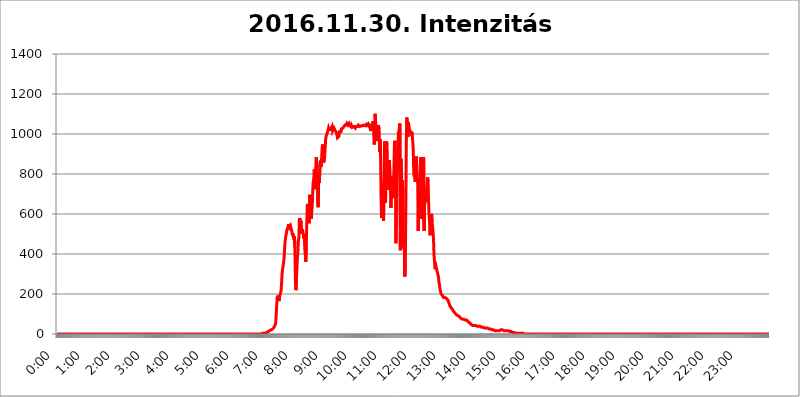
| Category | 2016.11.30. Intenzitás [W/m^2] |
|---|---|
| 0.0 | 0 |
| 0.0006944444444444445 | 0 |
| 0.001388888888888889 | 0 |
| 0.0020833333333333333 | 0 |
| 0.002777777777777778 | 0 |
| 0.003472222222222222 | 0 |
| 0.004166666666666667 | 0 |
| 0.004861111111111111 | 0 |
| 0.005555555555555556 | 0 |
| 0.0062499999999999995 | 0 |
| 0.006944444444444444 | 0 |
| 0.007638888888888889 | 0 |
| 0.008333333333333333 | 0 |
| 0.009027777777777779 | 0 |
| 0.009722222222222222 | 0 |
| 0.010416666666666666 | 0 |
| 0.011111111111111112 | 0 |
| 0.011805555555555555 | 0 |
| 0.012499999999999999 | 0 |
| 0.013194444444444444 | 0 |
| 0.013888888888888888 | 0 |
| 0.014583333333333332 | 0 |
| 0.015277777777777777 | 0 |
| 0.015972222222222224 | 0 |
| 0.016666666666666666 | 0 |
| 0.017361111111111112 | 0 |
| 0.018055555555555557 | 0 |
| 0.01875 | 0 |
| 0.019444444444444445 | 0 |
| 0.02013888888888889 | 0 |
| 0.020833333333333332 | 0 |
| 0.02152777777777778 | 0 |
| 0.022222222222222223 | 0 |
| 0.02291666666666667 | 0 |
| 0.02361111111111111 | 0 |
| 0.024305555555555556 | 0 |
| 0.024999999999999998 | 0 |
| 0.025694444444444447 | 0 |
| 0.02638888888888889 | 0 |
| 0.027083333333333334 | 0 |
| 0.027777777777777776 | 0 |
| 0.02847222222222222 | 0 |
| 0.029166666666666664 | 0 |
| 0.029861111111111113 | 0 |
| 0.030555555555555555 | 0 |
| 0.03125 | 0 |
| 0.03194444444444445 | 0 |
| 0.03263888888888889 | 0 |
| 0.03333333333333333 | 0 |
| 0.034027777777777775 | 0 |
| 0.034722222222222224 | 0 |
| 0.035416666666666666 | 0 |
| 0.036111111111111115 | 0 |
| 0.03680555555555556 | 0 |
| 0.0375 | 0 |
| 0.03819444444444444 | 0 |
| 0.03888888888888889 | 0 |
| 0.03958333333333333 | 0 |
| 0.04027777777777778 | 0 |
| 0.04097222222222222 | 0 |
| 0.041666666666666664 | 0 |
| 0.042361111111111106 | 0 |
| 0.04305555555555556 | 0 |
| 0.043750000000000004 | 0 |
| 0.044444444444444446 | 0 |
| 0.04513888888888889 | 0 |
| 0.04583333333333334 | 0 |
| 0.04652777777777778 | 0 |
| 0.04722222222222222 | 0 |
| 0.04791666666666666 | 0 |
| 0.04861111111111111 | 0 |
| 0.049305555555555554 | 0 |
| 0.049999999999999996 | 0 |
| 0.05069444444444445 | 0 |
| 0.051388888888888894 | 0 |
| 0.052083333333333336 | 0 |
| 0.05277777777777778 | 0 |
| 0.05347222222222222 | 0 |
| 0.05416666666666667 | 0 |
| 0.05486111111111111 | 0 |
| 0.05555555555555555 | 0 |
| 0.05625 | 0 |
| 0.05694444444444444 | 0 |
| 0.057638888888888885 | 0 |
| 0.05833333333333333 | 0 |
| 0.05902777777777778 | 0 |
| 0.059722222222222225 | 0 |
| 0.06041666666666667 | 0 |
| 0.061111111111111116 | 0 |
| 0.06180555555555556 | 0 |
| 0.0625 | 0 |
| 0.06319444444444444 | 0 |
| 0.06388888888888888 | 0 |
| 0.06458333333333334 | 0 |
| 0.06527777777777778 | 0 |
| 0.06597222222222222 | 0 |
| 0.06666666666666667 | 0 |
| 0.06736111111111111 | 0 |
| 0.06805555555555555 | 0 |
| 0.06874999999999999 | 0 |
| 0.06944444444444443 | 0 |
| 0.07013888888888889 | 0 |
| 0.07083333333333333 | 0 |
| 0.07152777777777779 | 0 |
| 0.07222222222222223 | 0 |
| 0.07291666666666667 | 0 |
| 0.07361111111111111 | 0 |
| 0.07430555555555556 | 0 |
| 0.075 | 0 |
| 0.07569444444444444 | 0 |
| 0.0763888888888889 | 0 |
| 0.07708333333333334 | 0 |
| 0.07777777777777778 | 0 |
| 0.07847222222222222 | 0 |
| 0.07916666666666666 | 0 |
| 0.0798611111111111 | 0 |
| 0.08055555555555556 | 0 |
| 0.08125 | 0 |
| 0.08194444444444444 | 0 |
| 0.08263888888888889 | 0 |
| 0.08333333333333333 | 0 |
| 0.08402777777777777 | 0 |
| 0.08472222222222221 | 0 |
| 0.08541666666666665 | 0 |
| 0.08611111111111112 | 0 |
| 0.08680555555555557 | 0 |
| 0.08750000000000001 | 0 |
| 0.08819444444444445 | 0 |
| 0.08888888888888889 | 0 |
| 0.08958333333333333 | 0 |
| 0.09027777777777778 | 0 |
| 0.09097222222222222 | 0 |
| 0.09166666666666667 | 0 |
| 0.09236111111111112 | 0 |
| 0.09305555555555556 | 0 |
| 0.09375 | 0 |
| 0.09444444444444444 | 0 |
| 0.09513888888888888 | 0 |
| 0.09583333333333333 | 0 |
| 0.09652777777777777 | 0 |
| 0.09722222222222222 | 0 |
| 0.09791666666666667 | 0 |
| 0.09861111111111111 | 0 |
| 0.09930555555555555 | 0 |
| 0.09999999999999999 | 0 |
| 0.10069444444444443 | 0 |
| 0.1013888888888889 | 0 |
| 0.10208333333333335 | 0 |
| 0.10277777777777779 | 0 |
| 0.10347222222222223 | 0 |
| 0.10416666666666667 | 0 |
| 0.10486111111111111 | 0 |
| 0.10555555555555556 | 0 |
| 0.10625 | 0 |
| 0.10694444444444444 | 0 |
| 0.1076388888888889 | 0 |
| 0.10833333333333334 | 0 |
| 0.10902777777777778 | 0 |
| 0.10972222222222222 | 0 |
| 0.1111111111111111 | 0 |
| 0.11180555555555556 | 0 |
| 0.11180555555555556 | 0 |
| 0.1125 | 0 |
| 0.11319444444444444 | 0 |
| 0.11388888888888889 | 0 |
| 0.11458333333333333 | 0 |
| 0.11527777777777777 | 0 |
| 0.11597222222222221 | 0 |
| 0.11666666666666665 | 0 |
| 0.1173611111111111 | 0 |
| 0.11805555555555557 | 0 |
| 0.11944444444444445 | 0 |
| 0.12013888888888889 | 0 |
| 0.12083333333333333 | 0 |
| 0.12152777777777778 | 0 |
| 0.12222222222222223 | 0 |
| 0.12291666666666667 | 0 |
| 0.12291666666666667 | 0 |
| 0.12361111111111112 | 0 |
| 0.12430555555555556 | 0 |
| 0.125 | 0 |
| 0.12569444444444444 | 0 |
| 0.12638888888888888 | 0 |
| 0.12708333333333333 | 0 |
| 0.16875 | 0 |
| 0.12847222222222224 | 0 |
| 0.12916666666666668 | 0 |
| 0.12986111111111112 | 0 |
| 0.13055555555555556 | 0 |
| 0.13125 | 0 |
| 0.13194444444444445 | 0 |
| 0.1326388888888889 | 0 |
| 0.13333333333333333 | 0 |
| 0.13402777777777777 | 0 |
| 0.13402777777777777 | 0 |
| 0.13472222222222222 | 0 |
| 0.13541666666666666 | 0 |
| 0.1361111111111111 | 0 |
| 0.13749999999999998 | 0 |
| 0.13819444444444443 | 0 |
| 0.1388888888888889 | 0 |
| 0.13958333333333334 | 0 |
| 0.14027777777777778 | 0 |
| 0.14097222222222222 | 0 |
| 0.14166666666666666 | 0 |
| 0.1423611111111111 | 0 |
| 0.14305555555555557 | 0 |
| 0.14375000000000002 | 0 |
| 0.14444444444444446 | 0 |
| 0.1451388888888889 | 0 |
| 0.1451388888888889 | 0 |
| 0.14652777777777778 | 0 |
| 0.14722222222222223 | 0 |
| 0.14791666666666667 | 0 |
| 0.1486111111111111 | 0 |
| 0.14930555555555555 | 0 |
| 0.15 | 0 |
| 0.15069444444444444 | 0 |
| 0.15138888888888888 | 0 |
| 0.15208333333333332 | 0 |
| 0.15277777777777776 | 0 |
| 0.15347222222222223 | 0 |
| 0.15416666666666667 | 0 |
| 0.15486111111111112 | 0 |
| 0.15555555555555556 | 0 |
| 0.15625 | 0 |
| 0.15694444444444444 | 0 |
| 0.15763888888888888 | 0 |
| 0.15833333333333333 | 0 |
| 0.15902777777777777 | 0 |
| 0.15972222222222224 | 0 |
| 0.16041666666666668 | 0 |
| 0.16111111111111112 | 0 |
| 0.16180555555555556 | 0 |
| 0.1625 | 0 |
| 0.16319444444444445 | 0 |
| 0.1638888888888889 | 0 |
| 0.16458333333333333 | 0 |
| 0.16527777777777777 | 0 |
| 0.16597222222222222 | 0 |
| 0.16666666666666666 | 0 |
| 0.1673611111111111 | 0 |
| 0.16805555555555554 | 0 |
| 0.16874999999999998 | 0 |
| 0.16944444444444443 | 0 |
| 0.17013888888888887 | 0 |
| 0.1708333333333333 | 0 |
| 0.17152777777777775 | 0 |
| 0.17222222222222225 | 0 |
| 0.1729166666666667 | 0 |
| 0.17361111111111113 | 0 |
| 0.17430555555555557 | 0 |
| 0.17500000000000002 | 0 |
| 0.17569444444444446 | 0 |
| 0.1763888888888889 | 0 |
| 0.17708333333333334 | 0 |
| 0.17777777777777778 | 0 |
| 0.17847222222222223 | 0 |
| 0.17916666666666667 | 0 |
| 0.1798611111111111 | 0 |
| 0.18055555555555555 | 0 |
| 0.18125 | 0 |
| 0.18194444444444444 | 0 |
| 0.1826388888888889 | 0 |
| 0.18333333333333335 | 0 |
| 0.1840277777777778 | 0 |
| 0.18472222222222223 | 0 |
| 0.18541666666666667 | 0 |
| 0.18611111111111112 | 0 |
| 0.18680555555555556 | 0 |
| 0.1875 | 0 |
| 0.18819444444444444 | 0 |
| 0.18888888888888888 | 0 |
| 0.18958333333333333 | 0 |
| 0.19027777777777777 | 0 |
| 0.1909722222222222 | 0 |
| 0.19166666666666665 | 0 |
| 0.19236111111111112 | 0 |
| 0.19305555555555554 | 0 |
| 0.19375 | 0 |
| 0.19444444444444445 | 0 |
| 0.1951388888888889 | 0 |
| 0.19583333333333333 | 0 |
| 0.19652777777777777 | 0 |
| 0.19722222222222222 | 0 |
| 0.19791666666666666 | 0 |
| 0.1986111111111111 | 0 |
| 0.19930555555555554 | 0 |
| 0.19999999999999998 | 0 |
| 0.20069444444444443 | 0 |
| 0.20138888888888887 | 0 |
| 0.2020833333333333 | 0 |
| 0.2027777777777778 | 0 |
| 0.2034722222222222 | 0 |
| 0.2041666666666667 | 0 |
| 0.20486111111111113 | 0 |
| 0.20555555555555557 | 0 |
| 0.20625000000000002 | 0 |
| 0.20694444444444446 | 0 |
| 0.2076388888888889 | 0 |
| 0.20833333333333334 | 0 |
| 0.20902777777777778 | 0 |
| 0.20972222222222223 | 0 |
| 0.21041666666666667 | 0 |
| 0.2111111111111111 | 0 |
| 0.21180555555555555 | 0 |
| 0.2125 | 0 |
| 0.21319444444444444 | 0 |
| 0.2138888888888889 | 0 |
| 0.21458333333333335 | 0 |
| 0.2152777777777778 | 0 |
| 0.21597222222222223 | 0 |
| 0.21666666666666667 | 0 |
| 0.21736111111111112 | 0 |
| 0.21805555555555556 | 0 |
| 0.21875 | 0 |
| 0.21944444444444444 | 0 |
| 0.22013888888888888 | 0 |
| 0.22083333333333333 | 0 |
| 0.22152777777777777 | 0 |
| 0.2222222222222222 | 0 |
| 0.22291666666666665 | 0 |
| 0.2236111111111111 | 0 |
| 0.22430555555555556 | 0 |
| 0.225 | 0 |
| 0.22569444444444445 | 0 |
| 0.2263888888888889 | 0 |
| 0.22708333333333333 | 0 |
| 0.22777777777777777 | 0 |
| 0.22847222222222222 | 0 |
| 0.22916666666666666 | 0 |
| 0.2298611111111111 | 0 |
| 0.23055555555555554 | 0 |
| 0.23124999999999998 | 0 |
| 0.23194444444444443 | 0 |
| 0.23263888888888887 | 0 |
| 0.2333333333333333 | 0 |
| 0.2340277777777778 | 0 |
| 0.2347222222222222 | 0 |
| 0.2354166666666667 | 0 |
| 0.23611111111111113 | 0 |
| 0.23680555555555557 | 0 |
| 0.23750000000000002 | 0 |
| 0.23819444444444446 | 0 |
| 0.2388888888888889 | 0 |
| 0.23958333333333334 | 0 |
| 0.24027777777777778 | 0 |
| 0.24097222222222223 | 0 |
| 0.24166666666666667 | 0 |
| 0.2423611111111111 | 0 |
| 0.24305555555555555 | 0 |
| 0.24375 | 0 |
| 0.24444444444444446 | 0 |
| 0.24513888888888888 | 0 |
| 0.24583333333333335 | 0 |
| 0.2465277777777778 | 0 |
| 0.24722222222222223 | 0 |
| 0.24791666666666667 | 0 |
| 0.24861111111111112 | 0 |
| 0.24930555555555556 | 0 |
| 0.25 | 0 |
| 0.25069444444444444 | 0 |
| 0.2513888888888889 | 0 |
| 0.2520833333333333 | 0 |
| 0.25277777777777777 | 0 |
| 0.2534722222222222 | 0 |
| 0.25416666666666665 | 0 |
| 0.2548611111111111 | 0 |
| 0.2555555555555556 | 0 |
| 0.25625000000000003 | 0 |
| 0.2569444444444445 | 0 |
| 0.2576388888888889 | 0 |
| 0.25833333333333336 | 0 |
| 0.2590277777777778 | 0 |
| 0.25972222222222224 | 0 |
| 0.2604166666666667 | 0 |
| 0.2611111111111111 | 0 |
| 0.26180555555555557 | 0 |
| 0.2625 | 0 |
| 0.26319444444444445 | 0 |
| 0.2638888888888889 | 0 |
| 0.26458333333333334 | 0 |
| 0.2652777777777778 | 0 |
| 0.2659722222222222 | 0 |
| 0.26666666666666666 | 0 |
| 0.2673611111111111 | 0 |
| 0.26805555555555555 | 0 |
| 0.26875 | 0 |
| 0.26944444444444443 | 0 |
| 0.2701388888888889 | 0 |
| 0.2708333333333333 | 0 |
| 0.27152777777777776 | 0 |
| 0.2722222222222222 | 0 |
| 0.27291666666666664 | 0 |
| 0.2736111111111111 | 0 |
| 0.2743055555555555 | 0 |
| 0.27499999999999997 | 0 |
| 0.27569444444444446 | 0 |
| 0.27638888888888885 | 0 |
| 0.27708333333333335 | 0 |
| 0.2777777777777778 | 0 |
| 0.27847222222222223 | 0 |
| 0.2791666666666667 | 0 |
| 0.2798611111111111 | 0 |
| 0.28055555555555556 | 0 |
| 0.28125 | 0 |
| 0.28194444444444444 | 0 |
| 0.2826388888888889 | 0 |
| 0.2833333333333333 | 0 |
| 0.28402777777777777 | 0 |
| 0.2847222222222222 | 0 |
| 0.28541666666666665 | 0 |
| 0.28611111111111115 | 0 |
| 0.28680555555555554 | 0 |
| 0.28750000000000003 | 3.525 |
| 0.2881944444444445 | 3.525 |
| 0.2888888888888889 | 3.525 |
| 0.28958333333333336 | 3.525 |
| 0.2902777777777778 | 3.525 |
| 0.29097222222222224 | 3.525 |
| 0.2916666666666667 | 3.525 |
| 0.2923611111111111 | 7.887 |
| 0.29305555555555557 | 7.887 |
| 0.29375 | 7.887 |
| 0.29444444444444445 | 12.257 |
| 0.2951388888888889 | 12.257 |
| 0.29583333333333334 | 12.257 |
| 0.2965277777777778 | 12.257 |
| 0.2972222222222222 | 12.257 |
| 0.29791666666666666 | 16.636 |
| 0.2986111111111111 | 16.636 |
| 0.29930555555555555 | 16.636 |
| 0.3 | 21.024 |
| 0.30069444444444443 | 21.024 |
| 0.3013888888888889 | 25.419 |
| 0.3020833333333333 | 25.419 |
| 0.30277777777777776 | 29.823 |
| 0.3034722222222222 | 29.823 |
| 0.30416666666666664 | 34.234 |
| 0.3048611111111111 | 34.234 |
| 0.3055555555555555 | 38.653 |
| 0.30624999999999997 | 51.951 |
| 0.3069444444444444 | 87.692 |
| 0.3076388888888889 | 132.814 |
| 0.30833333333333335 | 178.264 |
| 0.3090277777777778 | 191.937 |
| 0.30972222222222223 | 182.82 |
| 0.3104166666666667 | 178.264 |
| 0.3111111111111111 | 164.605 |
| 0.31180555555555556 | 187.378 |
| 0.3125 | 196.497 |
| 0.31319444444444444 | 196.497 |
| 0.3138888888888889 | 214.746 |
| 0.3145833333333333 | 251.251 |
| 0.31527777777777777 | 296.808 |
| 0.3159722222222222 | 324.052 |
| 0.31666666666666665 | 337.639 |
| 0.31736111111111115 | 342.162 |
| 0.31805555555555554 | 373.729 |
| 0.31875000000000003 | 418.492 |
| 0.3194444444444445 | 458.38 |
| 0.3201388888888889 | 480.356 |
| 0.32083333333333336 | 493.475 |
| 0.3215277777777778 | 506.542 |
| 0.32222222222222224 | 523.88 |
| 0.3229166666666667 | 523.88 |
| 0.3236111111111111 | 532.513 |
| 0.32430555555555557 | 549.704 |
| 0.325 | 549.704 |
| 0.32569444444444445 | 532.513 |
| 0.3263888888888889 | 532.513 |
| 0.32708333333333334 | 541.121 |
| 0.3277777777777778 | 545.416 |
| 0.3284722222222222 | 545.416 |
| 0.32916666666666666 | 510.885 |
| 0.3298611111111111 | 493.475 |
| 0.33055555555555555 | 502.192 |
| 0.33125 | 484.735 |
| 0.33194444444444443 | 471.582 |
| 0.3326388888888889 | 489.108 |
| 0.3333333333333333 | 431.833 |
| 0.3340277777777778 | 269.49 |
| 0.3347222222222222 | 219.309 |
| 0.3354166666666667 | 274.047 |
| 0.3361111111111111 | 324.052 |
| 0.3368055555555556 | 378.224 |
| 0.33749999999999997 | 414.035 |
| 0.33819444444444446 | 467.187 |
| 0.33888888888888885 | 480.356 |
| 0.33958333333333335 | 571.049 |
| 0.34027777777777773 | 579.542 |
| 0.34097222222222223 | 558.261 |
| 0.3416666666666666 | 566.793 |
| 0.3423611111111111 | 515.223 |
| 0.3430555555555555 | 502.192 |
| 0.34375 | 523.88 |
| 0.3444444444444445 | 510.885 |
| 0.3451388888888889 | 497.836 |
| 0.3458333333333334 | 475.972 |
| 0.34652777777777777 | 497.836 |
| 0.34722222222222227 | 497.836 |
| 0.34791666666666665 | 400.638 |
| 0.34861111111111115 | 360.221 |
| 0.34930555555555554 | 445.129 |
| 0.35000000000000003 | 558.261 |
| 0.3506944444444444 | 642.4 |
| 0.3513888888888889 | 650.667 |
| 0.3520833333333333 | 634.105 |
| 0.3527777777777778 | 609.062 |
| 0.3534722222222222 | 553.986 |
| 0.3541666666666667 | 695.666 |
| 0.3548611111111111 | 646.537 |
| 0.35555555555555557 | 600.661 |
| 0.35625 | 575.299 |
| 0.35694444444444445 | 617.436 |
| 0.3576388888888889 | 638.256 |
| 0.35833333333333334 | 715.858 |
| 0.3590277777777778 | 763.674 |
| 0.3597222222222222 | 771.559 |
| 0.36041666666666666 | 822.26 |
| 0.3611111111111111 | 798.974 |
| 0.36180555555555555 | 723.889 |
| 0.3625 | 810.641 |
| 0.36319444444444443 | 883.516 |
| 0.3638888888888889 | 879.719 |
| 0.3645833333333333 | 837.682 |
| 0.3652777777777778 | 650.667 |
| 0.3659722222222222 | 634.105 |
| 0.3666666666666667 | 767.62 |
| 0.3673611111111111 | 755.766 |
| 0.3680555555555556 | 795.074 |
| 0.36874999999999997 | 829.981 |
| 0.36944444444444446 | 868.305 |
| 0.37013888888888885 | 837.682 |
| 0.37083333333333335 | 879.719 |
| 0.37152777777777773 | 928.819 |
| 0.37222222222222223 | 947.58 |
| 0.3729166666666666 | 925.06 |
| 0.3736111111111111 | 856.855 |
| 0.3743055555555555 | 864.493 |
| 0.375 | 883.516 |
| 0.3756944444444445 | 928.819 |
| 0.3763888888888889 | 970.034 |
| 0.3770833333333334 | 988.714 |
| 0.37777777777777777 | 996.182 |
| 0.37847222222222227 | 1003.65 |
| 0.37916666666666665 | 1011.118 |
| 0.37986111111111115 | 1018.587 |
| 0.38055555555555554 | 1029.798 |
| 0.38125000000000003 | 1022.323 |
| 0.3819444444444444 | 1018.587 |
| 0.3826388888888889 | 1022.323 |
| 0.3833333333333333 | 1022.323 |
| 0.3840277777777778 | 1026.06 |
| 0.3847222222222222 | 1022.323 |
| 0.3854166666666667 | 1037.277 |
| 0.3861111111111111 | 1014.852 |
| 0.38680555555555557 | 1014.852 |
| 0.3875 | 1018.587 |
| 0.38819444444444445 | 1029.798 |
| 0.3888888888888889 | 1033.537 |
| 0.38958333333333334 | 1026.06 |
| 0.3902777777777778 | 1014.852 |
| 0.3909722222222222 | 1011.118 |
| 0.39166666666666666 | 1007.383 |
| 0.3923611111111111 | 992.448 |
| 0.39305555555555555 | 981.244 |
| 0.39375 | 984.98 |
| 0.39444444444444443 | 981.244 |
| 0.3951388888888889 | 988.714 |
| 0.3958333333333333 | 1011.118 |
| 0.3965277777777778 | 1014.852 |
| 0.3972222222222222 | 1007.383 |
| 0.3979166666666667 | 1011.118 |
| 0.3986111111111111 | 1026.06 |
| 0.3993055555555556 | 1026.06 |
| 0.39999999999999997 | 1029.798 |
| 0.40069444444444446 | 1029.798 |
| 0.40138888888888885 | 1033.537 |
| 0.40208333333333335 | 1037.277 |
| 0.40277777777777773 | 1033.537 |
| 0.40347222222222223 | 1044.762 |
| 0.4041666666666666 | 1044.762 |
| 0.4048611111111111 | 1048.508 |
| 0.4055555555555555 | 1044.762 |
| 0.40625 | 1052.255 |
| 0.4069444444444445 | 1052.255 |
| 0.4076388888888889 | 1044.762 |
| 0.4083333333333334 | 1044.762 |
| 0.40902777777777777 | 1052.255 |
| 0.40972222222222227 | 1044.762 |
| 0.41041666666666665 | 1044.762 |
| 0.41111111111111115 | 1041.019 |
| 0.41180555555555554 | 1037.277 |
| 0.41250000000000003 | 1044.762 |
| 0.4131944444444444 | 1041.019 |
| 0.4138888888888889 | 1033.537 |
| 0.4145833333333333 | 1037.277 |
| 0.4152777777777778 | 1033.537 |
| 0.4159722222222222 | 1037.277 |
| 0.4166666666666667 | 1037.277 |
| 0.4173611111111111 | 1037.277 |
| 0.41805555555555557 | 1029.798 |
| 0.41875 | 1037.277 |
| 0.41944444444444445 | 1041.019 |
| 0.4201388888888889 | 1041.019 |
| 0.42083333333333334 | 1037.277 |
| 0.4215277777777778 | 1037.277 |
| 0.4222222222222222 | 1044.762 |
| 0.42291666666666666 | 1041.019 |
| 0.4236111111111111 | 1041.019 |
| 0.42430555555555555 | 1037.277 |
| 0.425 | 1041.019 |
| 0.42569444444444443 | 1037.277 |
| 0.4263888888888889 | 1041.019 |
| 0.4270833333333333 | 1044.762 |
| 0.4277777777777778 | 1041.019 |
| 0.4284722222222222 | 1041.019 |
| 0.4291666666666667 | 1041.019 |
| 0.4298611111111111 | 1044.762 |
| 0.4305555555555556 | 1044.762 |
| 0.43124999999999997 | 1044.762 |
| 0.43194444444444446 | 1044.762 |
| 0.43263888888888885 | 1041.019 |
| 0.43333333333333335 | 1041.019 |
| 0.43402777777777773 | 1048.508 |
| 0.43472222222222223 | 1048.508 |
| 0.4354166666666666 | 1048.508 |
| 0.4361111111111111 | 1041.019 |
| 0.4368055555555555 | 1048.508 |
| 0.4375 | 1044.762 |
| 0.4381944444444445 | 1041.019 |
| 0.4388888888888889 | 1044.762 |
| 0.4395833333333334 | 1014.852 |
| 0.44027777777777777 | 1037.277 |
| 0.44097222222222227 | 1044.762 |
| 0.44166666666666665 | 1048.508 |
| 0.44236111111111115 | 1056.004 |
| 0.44305555555555554 | 1063.51 |
| 0.44375000000000003 | 1022.323 |
| 0.4444444444444444 | 947.58 |
| 0.4451388888888889 | 962.555 |
| 0.4458333333333333 | 1101.226 |
| 0.4465277777777778 | 1063.51 |
| 0.4472222222222222 | 966.295 |
| 0.4479166666666667 | 966.295 |
| 0.4486111111111111 | 1003.65 |
| 0.44930555555555557 | 1022.323 |
| 0.45 | 1044.762 |
| 0.45069444444444445 | 1048.508 |
| 0.4513888888888889 | 1026.06 |
| 0.45208333333333334 | 909.996 |
| 0.4527777777777778 | 973.772 |
| 0.4534722222222222 | 887.309 |
| 0.45416666666666666 | 687.544 |
| 0.4548611111111111 | 579.542 |
| 0.45555555555555555 | 751.803 |
| 0.45625 | 687.544 |
| 0.45694444444444443 | 735.89 |
| 0.4576388888888889 | 566.793 |
| 0.4583333333333333 | 775.492 |
| 0.4590277777777778 | 962.555 |
| 0.4597222222222222 | 962.555 |
| 0.4604166666666667 | 654.791 |
| 0.4611111111111111 | 932.576 |
| 0.4618055555555556 | 962.555 |
| 0.46249999999999997 | 947.58 |
| 0.46319444444444446 | 833.834 |
| 0.46388888888888885 | 787.258 |
| 0.46458333333333335 | 853.029 |
| 0.46527777777777773 | 719.877 |
| 0.46597222222222223 | 868.305 |
| 0.4666666666666666 | 751.803 |
| 0.4673611111111111 | 735.89 |
| 0.4680555555555555 | 629.948 |
| 0.46875 | 759.723 |
| 0.4694444444444445 | 787.258 |
| 0.4701388888888889 | 771.559 |
| 0.4708333333333334 | 679.395 |
| 0.47152777777777777 | 755.766 |
| 0.47222222222222227 | 822.26 |
| 0.47291666666666665 | 951.327 |
| 0.47361111111111115 | 966.295 |
| 0.47430555555555554 | 860.676 |
| 0.47500000000000003 | 453.968 |
| 0.4756944444444444 | 671.22 |
| 0.4763888888888889 | 783.342 |
| 0.4770833333333333 | 818.392 |
| 0.4777777777777778 | 932.576 |
| 0.4784722222222222 | 1011.118 |
| 0.4791666666666667 | 940.082 |
| 0.4798611111111111 | 1029.798 |
| 0.48055555555555557 | 1052.255 |
| 0.48125 | 418.492 |
| 0.48194444444444445 | 875.918 |
| 0.4826388888888889 | 798.974 |
| 0.48333333333333334 | 723.889 |
| 0.4840277777777778 | 767.62 |
| 0.4847222222222222 | 707.8 |
| 0.48541666666666666 | 462.786 |
| 0.4861111111111111 | 427.39 |
| 0.48680555555555555 | 440.702 |
| 0.4875 | 287.709 |
| 0.48819444444444443 | 360.221 |
| 0.4888888888888889 | 638.256 |
| 0.4895833333333333 | 962.555 |
| 0.4902777777777778 | 1082.324 |
| 0.4909722222222222 | 1078.555 |
| 0.4916666666666667 | 984.98 |
| 0.4923611111111111 | 1059.756 |
| 0.4930555555555556 | 1044.762 |
| 0.49374999999999997 | 1026.06 |
| 0.49444444444444446 | 1026.06 |
| 0.49513888888888885 | 1014.852 |
| 0.49583333333333335 | 999.916 |
| 0.49652777777777773 | 992.448 |
| 0.49722222222222223 | 1011.118 |
| 0.4979166666666666 | 992.448 |
| 0.4986111111111111 | 962.555 |
| 0.4993055555555555 | 921.298 |
| 0.5 | 810.641 |
| 0.5006944444444444 | 787.258 |
| 0.5013888888888889 | 806.757 |
| 0.5020833333333333 | 759.723 |
| 0.5027777777777778 | 787.258 |
| 0.5034722222222222 | 887.309 |
| 0.5041666666666667 | 833.834 |
| 0.5048611111111111 | 767.62 |
| 0.5055555555555555 | 755.766 |
| 0.50625 | 515.223 |
| 0.5069444444444444 | 719.877 |
| 0.5076388888888889 | 751.803 |
| 0.5083333333333333 | 775.492 |
| 0.5090277777777777 | 814.519 |
| 0.5097222222222222 | 883.516 |
| 0.5104166666666666 | 853.029 |
| 0.5111111111111112 | 575.299 |
| 0.5118055555555555 | 707.8 |
| 0.5125000000000001 | 822.26 |
| 0.5131944444444444 | 868.305 |
| 0.513888888888889 | 883.516 |
| 0.5145833333333333 | 515.223 |
| 0.5152777777777778 | 650.667 |
| 0.5159722222222222 | 699.717 |
| 0.5166666666666667 | 658.909 |
| 0.517361111111111 | 719.877 |
| 0.5180555555555556 | 707.8 |
| 0.5187499999999999 | 743.859 |
| 0.5194444444444445 | 783.342 |
| 0.5201388888888888 | 763.674 |
| 0.5208333333333334 | 654.791 |
| 0.5215277777777778 | 592.233 |
| 0.5222222222222223 | 553.986 |
| 0.5229166666666667 | 493.475 |
| 0.5236111111111111 | 541.121 |
| 0.5243055555555556 | 583.779 |
| 0.525 | 600.661 |
| 0.5256944444444445 | 562.53 |
| 0.5263888888888889 | 566.793 |
| 0.5270833333333333 | 506.542 |
| 0.5277777777777778 | 467.187 |
| 0.5284722222222222 | 391.685 |
| 0.5291666666666667 | 360.221 |
| 0.5298611111111111 | 324.052 |
| 0.5305555555555556 | 328.584 |
| 0.53125 | 337.639 |
| 0.5319444444444444 | 333.113 |
| 0.5326388888888889 | 314.98 |
| 0.5333333333333333 | 305.898 |
| 0.5340277777777778 | 305.898 |
| 0.5347222222222222 | 283.156 |
| 0.5354166666666667 | 255.813 |
| 0.5361111111111111 | 246.689 |
| 0.5368055555555555 | 223.873 |
| 0.5375 | 214.746 |
| 0.5381944444444444 | 201.058 |
| 0.5388888888888889 | 201.058 |
| 0.5395833333333333 | 196.497 |
| 0.5402777777777777 | 191.937 |
| 0.5409722222222222 | 187.378 |
| 0.5416666666666666 | 182.82 |
| 0.5423611111111112 | 182.82 |
| 0.5430555555555555 | 178.264 |
| 0.5437500000000001 | 182.82 |
| 0.5444444444444444 | 182.82 |
| 0.545138888888889 | 182.82 |
| 0.5458333333333333 | 178.264 |
| 0.5465277777777778 | 178.264 |
| 0.5472222222222222 | 173.709 |
| 0.5479166666666667 | 169.156 |
| 0.548611111111111 | 164.605 |
| 0.5493055555555556 | 155.509 |
| 0.5499999999999999 | 150.964 |
| 0.5506944444444445 | 141.884 |
| 0.5513888888888888 | 137.347 |
| 0.5520833333333334 | 132.814 |
| 0.5527777777777778 | 132.814 |
| 0.5534722222222223 | 128.284 |
| 0.5541666666666667 | 123.758 |
| 0.5548611111111111 | 119.235 |
| 0.5555555555555556 | 114.716 |
| 0.55625 | 110.201 |
| 0.5569444444444445 | 110.201 |
| 0.5576388888888889 | 105.69 |
| 0.5583333333333333 | 101.184 |
| 0.5590277777777778 | 101.184 |
| 0.5597222222222222 | 96.682 |
| 0.5604166666666667 | 96.682 |
| 0.5611111111111111 | 92.184 |
| 0.5618055555555556 | 92.184 |
| 0.5625 | 92.184 |
| 0.5631944444444444 | 92.184 |
| 0.5638888888888889 | 87.692 |
| 0.5645833333333333 | 87.692 |
| 0.5652777777777778 | 83.205 |
| 0.5659722222222222 | 78.722 |
| 0.5666666666666667 | 78.722 |
| 0.5673611111111111 | 74.246 |
| 0.5680555555555555 | 74.246 |
| 0.56875 | 74.246 |
| 0.5694444444444444 | 74.246 |
| 0.5701388888888889 | 74.246 |
| 0.5708333333333333 | 74.246 |
| 0.5715277777777777 | 74.246 |
| 0.5722222222222222 | 69.775 |
| 0.5729166666666666 | 69.775 |
| 0.5736111111111112 | 69.775 |
| 0.5743055555555555 | 69.775 |
| 0.5750000000000001 | 65.31 |
| 0.5756944444444444 | 65.31 |
| 0.576388888888889 | 60.85 |
| 0.5770833333333333 | 60.85 |
| 0.5777777777777778 | 56.398 |
| 0.5784722222222222 | 56.398 |
| 0.5791666666666667 | 51.951 |
| 0.579861111111111 | 51.951 |
| 0.5805555555555556 | 47.511 |
| 0.5812499999999999 | 47.511 |
| 0.5819444444444445 | 47.511 |
| 0.5826388888888888 | 43.079 |
| 0.5833333333333334 | 47.511 |
| 0.5840277777777778 | 47.511 |
| 0.5847222222222223 | 43.079 |
| 0.5854166666666667 | 43.079 |
| 0.5861111111111111 | 43.079 |
| 0.5868055555555556 | 43.079 |
| 0.5875 | 38.653 |
| 0.5881944444444445 | 43.079 |
| 0.5888888888888889 | 38.653 |
| 0.5895833333333333 | 38.653 |
| 0.5902777777777778 | 38.653 |
| 0.5909722222222222 | 38.653 |
| 0.5916666666666667 | 38.653 |
| 0.5923611111111111 | 38.653 |
| 0.5930555555555556 | 38.653 |
| 0.59375 | 38.653 |
| 0.5944444444444444 | 34.234 |
| 0.5951388888888889 | 34.234 |
| 0.5958333333333333 | 34.234 |
| 0.5965277777777778 | 34.234 |
| 0.5972222222222222 | 34.234 |
| 0.5979166666666667 | 34.234 |
| 0.5986111111111111 | 29.823 |
| 0.5993055555555555 | 29.823 |
| 0.6 | 29.823 |
| 0.6006944444444444 | 29.823 |
| 0.6013888888888889 | 29.823 |
| 0.6020833333333333 | 29.823 |
| 0.6027777777777777 | 29.823 |
| 0.6034722222222222 | 29.823 |
| 0.6041666666666666 | 25.419 |
| 0.6048611111111112 | 25.419 |
| 0.6055555555555555 | 25.419 |
| 0.6062500000000001 | 25.419 |
| 0.6069444444444444 | 25.419 |
| 0.607638888888889 | 25.419 |
| 0.6083333333333333 | 25.419 |
| 0.6090277777777778 | 21.024 |
| 0.6097222222222222 | 21.024 |
| 0.6104166666666667 | 21.024 |
| 0.611111111111111 | 21.024 |
| 0.6118055555555556 | 21.024 |
| 0.6124999999999999 | 21.024 |
| 0.6131944444444445 | 16.636 |
| 0.6138888888888888 | 16.636 |
| 0.6145833333333334 | 16.636 |
| 0.6152777777777778 | 16.636 |
| 0.6159722222222223 | 16.636 |
| 0.6166666666666667 | 16.636 |
| 0.6173611111111111 | 16.636 |
| 0.6180555555555556 | 16.636 |
| 0.61875 | 16.636 |
| 0.6194444444444445 | 16.636 |
| 0.6201388888888889 | 16.636 |
| 0.6208333333333333 | 21.024 |
| 0.6215277777777778 | 21.024 |
| 0.6222222222222222 | 21.024 |
| 0.6229166666666667 | 21.024 |
| 0.6236111111111111 | 21.024 |
| 0.6243055555555556 | 21.024 |
| 0.625 | 21.024 |
| 0.6256944444444444 | 21.024 |
| 0.6263888888888889 | 16.636 |
| 0.6270833333333333 | 16.636 |
| 0.6277777777777778 | 16.636 |
| 0.6284722222222222 | 16.636 |
| 0.6291666666666667 | 16.636 |
| 0.6298611111111111 | 16.636 |
| 0.6305555555555555 | 16.636 |
| 0.63125 | 16.636 |
| 0.6319444444444444 | 16.636 |
| 0.6326388888888889 | 16.636 |
| 0.6333333333333333 | 12.257 |
| 0.6340277777777777 | 12.257 |
| 0.6347222222222222 | 12.257 |
| 0.6354166666666666 | 12.257 |
| 0.6361111111111112 | 12.257 |
| 0.6368055555555555 | 12.257 |
| 0.6375000000000001 | 12.257 |
| 0.6381944444444444 | 7.887 |
| 0.638888888888889 | 7.887 |
| 0.6395833333333333 | 7.887 |
| 0.6402777777777778 | 7.887 |
| 0.6409722222222222 | 7.887 |
| 0.6416666666666667 | 3.525 |
| 0.642361111111111 | 3.525 |
| 0.6430555555555556 | 3.525 |
| 0.6437499999999999 | 3.525 |
| 0.6444444444444445 | 3.525 |
| 0.6451388888888888 | 3.525 |
| 0.6458333333333334 | 3.525 |
| 0.6465277777777778 | 3.525 |
| 0.6472222222222223 | 3.525 |
| 0.6479166666666667 | 3.525 |
| 0.6486111111111111 | 3.525 |
| 0.6493055555555556 | 3.525 |
| 0.65 | 3.525 |
| 0.6506944444444445 | 3.525 |
| 0.6513888888888889 | 3.525 |
| 0.6520833333333333 | 0 |
| 0.6527777777777778 | 3.525 |
| 0.6534722222222222 | 3.525 |
| 0.6541666666666667 | 0 |
| 0.6548611111111111 | 0 |
| 0.6555555555555556 | 0 |
| 0.65625 | 0 |
| 0.6569444444444444 | 0 |
| 0.6576388888888889 | 0 |
| 0.6583333333333333 | 0 |
| 0.6590277777777778 | 0 |
| 0.6597222222222222 | 0 |
| 0.6604166666666667 | 0 |
| 0.6611111111111111 | 0 |
| 0.6618055555555555 | 0 |
| 0.6625 | 0 |
| 0.6631944444444444 | 0 |
| 0.6638888888888889 | 0 |
| 0.6645833333333333 | 0 |
| 0.6652777777777777 | 0 |
| 0.6659722222222222 | 0 |
| 0.6666666666666666 | 0 |
| 0.6673611111111111 | 0 |
| 0.6680555555555556 | 0 |
| 0.6687500000000001 | 0 |
| 0.6694444444444444 | 0 |
| 0.6701388888888888 | 0 |
| 0.6708333333333334 | 0 |
| 0.6715277777777778 | 0 |
| 0.6722222222222222 | 0 |
| 0.6729166666666666 | 0 |
| 0.6736111111111112 | 0 |
| 0.6743055555555556 | 0 |
| 0.6749999999999999 | 0 |
| 0.6756944444444444 | 0 |
| 0.6763888888888889 | 0 |
| 0.6770833333333334 | 0 |
| 0.6777777777777777 | 0 |
| 0.6784722222222223 | 0 |
| 0.6791666666666667 | 0 |
| 0.6798611111111111 | 0 |
| 0.6805555555555555 | 0 |
| 0.68125 | 0 |
| 0.6819444444444445 | 0 |
| 0.6826388888888889 | 0 |
| 0.6833333333333332 | 0 |
| 0.6840277777777778 | 0 |
| 0.6847222222222222 | 0 |
| 0.6854166666666667 | 0 |
| 0.686111111111111 | 0 |
| 0.6868055555555556 | 0 |
| 0.6875 | 0 |
| 0.6881944444444444 | 0 |
| 0.688888888888889 | 0 |
| 0.6895833333333333 | 0 |
| 0.6902777777777778 | 0 |
| 0.6909722222222222 | 0 |
| 0.6916666666666668 | 0 |
| 0.6923611111111111 | 0 |
| 0.6930555555555555 | 0 |
| 0.69375 | 0 |
| 0.6944444444444445 | 0 |
| 0.6951388888888889 | 0 |
| 0.6958333333333333 | 0 |
| 0.6965277777777777 | 0 |
| 0.6972222222222223 | 0 |
| 0.6979166666666666 | 0 |
| 0.6986111111111111 | 0 |
| 0.6993055555555556 | 0 |
| 0.7000000000000001 | 0 |
| 0.7006944444444444 | 0 |
| 0.7013888888888888 | 0 |
| 0.7020833333333334 | 0 |
| 0.7027777777777778 | 0 |
| 0.7034722222222222 | 0 |
| 0.7041666666666666 | 0 |
| 0.7048611111111112 | 0 |
| 0.7055555555555556 | 0 |
| 0.7062499999999999 | 0 |
| 0.7069444444444444 | 0 |
| 0.7076388888888889 | 0 |
| 0.7083333333333334 | 0 |
| 0.7090277777777777 | 0 |
| 0.7097222222222223 | 0 |
| 0.7104166666666667 | 0 |
| 0.7111111111111111 | 0 |
| 0.7118055555555555 | 0 |
| 0.7125 | 0 |
| 0.7131944444444445 | 0 |
| 0.7138888888888889 | 0 |
| 0.7145833333333332 | 0 |
| 0.7152777777777778 | 0 |
| 0.7159722222222222 | 0 |
| 0.7166666666666667 | 0 |
| 0.717361111111111 | 0 |
| 0.7180555555555556 | 0 |
| 0.71875 | 0 |
| 0.7194444444444444 | 0 |
| 0.720138888888889 | 0 |
| 0.7208333333333333 | 0 |
| 0.7215277777777778 | 0 |
| 0.7222222222222222 | 0 |
| 0.7229166666666668 | 0 |
| 0.7236111111111111 | 0 |
| 0.7243055555555555 | 0 |
| 0.725 | 0 |
| 0.7256944444444445 | 0 |
| 0.7263888888888889 | 0 |
| 0.7270833333333333 | 0 |
| 0.7277777777777777 | 0 |
| 0.7284722222222223 | 0 |
| 0.7291666666666666 | 0 |
| 0.7298611111111111 | 0 |
| 0.7305555555555556 | 0 |
| 0.7312500000000001 | 0 |
| 0.7319444444444444 | 0 |
| 0.7326388888888888 | 0 |
| 0.7333333333333334 | 0 |
| 0.7340277777777778 | 0 |
| 0.7347222222222222 | 0 |
| 0.7354166666666666 | 0 |
| 0.7361111111111112 | 0 |
| 0.7368055555555556 | 0 |
| 0.7374999999999999 | 0 |
| 0.7381944444444444 | 0 |
| 0.7388888888888889 | 0 |
| 0.7395833333333334 | 0 |
| 0.7402777777777777 | 0 |
| 0.7409722222222223 | 0 |
| 0.7416666666666667 | 0 |
| 0.7423611111111111 | 0 |
| 0.7430555555555555 | 0 |
| 0.74375 | 0 |
| 0.7444444444444445 | 0 |
| 0.7451388888888889 | 0 |
| 0.7458333333333332 | 0 |
| 0.7465277777777778 | 0 |
| 0.7472222222222222 | 0 |
| 0.7479166666666667 | 0 |
| 0.748611111111111 | 0 |
| 0.7493055555555556 | 0 |
| 0.75 | 0 |
| 0.7506944444444444 | 0 |
| 0.751388888888889 | 0 |
| 0.7520833333333333 | 0 |
| 0.7527777777777778 | 0 |
| 0.7534722222222222 | 0 |
| 0.7541666666666668 | 0 |
| 0.7548611111111111 | 0 |
| 0.7555555555555555 | 0 |
| 0.75625 | 0 |
| 0.7569444444444445 | 0 |
| 0.7576388888888889 | 0 |
| 0.7583333333333333 | 0 |
| 0.7590277777777777 | 0 |
| 0.7597222222222223 | 0 |
| 0.7604166666666666 | 0 |
| 0.7611111111111111 | 0 |
| 0.7618055555555556 | 0 |
| 0.7625000000000001 | 0 |
| 0.7631944444444444 | 0 |
| 0.7638888888888888 | 0 |
| 0.7645833333333334 | 0 |
| 0.7652777777777778 | 0 |
| 0.7659722222222222 | 0 |
| 0.7666666666666666 | 0 |
| 0.7673611111111112 | 0 |
| 0.7680555555555556 | 0 |
| 0.7687499999999999 | 0 |
| 0.7694444444444444 | 0 |
| 0.7701388888888889 | 0 |
| 0.7708333333333334 | 0 |
| 0.7715277777777777 | 0 |
| 0.7722222222222223 | 0 |
| 0.7729166666666667 | 0 |
| 0.7736111111111111 | 0 |
| 0.7743055555555555 | 0 |
| 0.775 | 0 |
| 0.7756944444444445 | 0 |
| 0.7763888888888889 | 0 |
| 0.7770833333333332 | 0 |
| 0.7777777777777778 | 0 |
| 0.7784722222222222 | 0 |
| 0.7791666666666667 | 0 |
| 0.779861111111111 | 0 |
| 0.7805555555555556 | 0 |
| 0.78125 | 0 |
| 0.7819444444444444 | 0 |
| 0.782638888888889 | 0 |
| 0.7833333333333333 | 0 |
| 0.7840277777777778 | 0 |
| 0.7847222222222222 | 0 |
| 0.7854166666666668 | 0 |
| 0.7861111111111111 | 0 |
| 0.7868055555555555 | 0 |
| 0.7875 | 0 |
| 0.7881944444444445 | 0 |
| 0.7888888888888889 | 0 |
| 0.7895833333333333 | 0 |
| 0.7902777777777777 | 0 |
| 0.7909722222222223 | 0 |
| 0.7916666666666666 | 0 |
| 0.7923611111111111 | 0 |
| 0.7930555555555556 | 0 |
| 0.7937500000000001 | 0 |
| 0.7944444444444444 | 0 |
| 0.7951388888888888 | 0 |
| 0.7958333333333334 | 0 |
| 0.7965277777777778 | 0 |
| 0.7972222222222222 | 0 |
| 0.7979166666666666 | 0 |
| 0.7986111111111112 | 0 |
| 0.7993055555555556 | 0 |
| 0.7999999999999999 | 0 |
| 0.8006944444444444 | 0 |
| 0.8013888888888889 | 0 |
| 0.8020833333333334 | 0 |
| 0.8027777777777777 | 0 |
| 0.8034722222222223 | 0 |
| 0.8041666666666667 | 0 |
| 0.8048611111111111 | 0 |
| 0.8055555555555555 | 0 |
| 0.80625 | 0 |
| 0.8069444444444445 | 0 |
| 0.8076388888888889 | 0 |
| 0.8083333333333332 | 0 |
| 0.8090277777777778 | 0 |
| 0.8097222222222222 | 0 |
| 0.8104166666666667 | 0 |
| 0.811111111111111 | 0 |
| 0.8118055555555556 | 0 |
| 0.8125 | 0 |
| 0.8131944444444444 | 0 |
| 0.813888888888889 | 0 |
| 0.8145833333333333 | 0 |
| 0.8152777777777778 | 0 |
| 0.8159722222222222 | 0 |
| 0.8166666666666668 | 0 |
| 0.8173611111111111 | 0 |
| 0.8180555555555555 | 0 |
| 0.81875 | 0 |
| 0.8194444444444445 | 0 |
| 0.8201388888888889 | 0 |
| 0.8208333333333333 | 0 |
| 0.8215277777777777 | 0 |
| 0.8222222222222223 | 0 |
| 0.8229166666666666 | 0 |
| 0.8236111111111111 | 0 |
| 0.8243055555555556 | 0 |
| 0.8250000000000001 | 0 |
| 0.8256944444444444 | 0 |
| 0.8263888888888888 | 0 |
| 0.8270833333333334 | 0 |
| 0.8277777777777778 | 0 |
| 0.8284722222222222 | 0 |
| 0.8291666666666666 | 0 |
| 0.8298611111111112 | 0 |
| 0.8305555555555556 | 0 |
| 0.8312499999999999 | 0 |
| 0.8319444444444444 | 0 |
| 0.8326388888888889 | 0 |
| 0.8333333333333334 | 0 |
| 0.8340277777777777 | 0 |
| 0.8347222222222223 | 0 |
| 0.8354166666666667 | 0 |
| 0.8361111111111111 | 0 |
| 0.8368055555555555 | 0 |
| 0.8375 | 0 |
| 0.8381944444444445 | 0 |
| 0.8388888888888889 | 0 |
| 0.8395833333333332 | 0 |
| 0.8402777777777778 | 0 |
| 0.8409722222222222 | 0 |
| 0.8416666666666667 | 0 |
| 0.842361111111111 | 0 |
| 0.8430555555555556 | 0 |
| 0.84375 | 0 |
| 0.8444444444444444 | 0 |
| 0.845138888888889 | 0 |
| 0.8458333333333333 | 0 |
| 0.8465277777777778 | 0 |
| 0.8472222222222222 | 0 |
| 0.8479166666666668 | 0 |
| 0.8486111111111111 | 0 |
| 0.8493055555555555 | 0 |
| 0.85 | 0 |
| 0.8506944444444445 | 0 |
| 0.8513888888888889 | 0 |
| 0.8520833333333333 | 0 |
| 0.8527777777777777 | 0 |
| 0.8534722222222223 | 0 |
| 0.8541666666666666 | 0 |
| 0.8548611111111111 | 0 |
| 0.8555555555555556 | 0 |
| 0.8562500000000001 | 0 |
| 0.8569444444444444 | 0 |
| 0.8576388888888888 | 0 |
| 0.8583333333333334 | 0 |
| 0.8590277777777778 | 0 |
| 0.8597222222222222 | 0 |
| 0.8604166666666666 | 0 |
| 0.8611111111111112 | 0 |
| 0.8618055555555556 | 0 |
| 0.8624999999999999 | 0 |
| 0.8631944444444444 | 0 |
| 0.8638888888888889 | 0 |
| 0.8645833333333334 | 0 |
| 0.8652777777777777 | 0 |
| 0.8659722222222223 | 0 |
| 0.8666666666666667 | 0 |
| 0.8673611111111111 | 0 |
| 0.8680555555555555 | 0 |
| 0.86875 | 0 |
| 0.8694444444444445 | 0 |
| 0.8701388888888889 | 0 |
| 0.8708333333333332 | 0 |
| 0.8715277777777778 | 0 |
| 0.8722222222222222 | 0 |
| 0.8729166666666667 | 0 |
| 0.873611111111111 | 0 |
| 0.8743055555555556 | 0 |
| 0.875 | 0 |
| 0.8756944444444444 | 0 |
| 0.876388888888889 | 0 |
| 0.8770833333333333 | 0 |
| 0.8777777777777778 | 0 |
| 0.8784722222222222 | 0 |
| 0.8791666666666668 | 0 |
| 0.8798611111111111 | 0 |
| 0.8805555555555555 | 0 |
| 0.88125 | 0 |
| 0.8819444444444445 | 0 |
| 0.8826388888888889 | 0 |
| 0.8833333333333333 | 0 |
| 0.8840277777777777 | 0 |
| 0.8847222222222223 | 0 |
| 0.8854166666666666 | 0 |
| 0.8861111111111111 | 0 |
| 0.8868055555555556 | 0 |
| 0.8875000000000001 | 0 |
| 0.8881944444444444 | 0 |
| 0.8888888888888888 | 0 |
| 0.8895833333333334 | 0 |
| 0.8902777777777778 | 0 |
| 0.8909722222222222 | 0 |
| 0.8916666666666666 | 0 |
| 0.8923611111111112 | 0 |
| 0.8930555555555556 | 0 |
| 0.8937499999999999 | 0 |
| 0.8944444444444444 | 0 |
| 0.8951388888888889 | 0 |
| 0.8958333333333334 | 0 |
| 0.8965277777777777 | 0 |
| 0.8972222222222223 | 0 |
| 0.8979166666666667 | 0 |
| 0.8986111111111111 | 0 |
| 0.8993055555555555 | 0 |
| 0.9 | 0 |
| 0.9006944444444445 | 0 |
| 0.9013888888888889 | 0 |
| 0.9020833333333332 | 0 |
| 0.9027777777777778 | 0 |
| 0.9034722222222222 | 0 |
| 0.9041666666666667 | 0 |
| 0.904861111111111 | 0 |
| 0.9055555555555556 | 0 |
| 0.90625 | 0 |
| 0.9069444444444444 | 0 |
| 0.907638888888889 | 0 |
| 0.9083333333333333 | 0 |
| 0.9090277777777778 | 0 |
| 0.9097222222222222 | 0 |
| 0.9104166666666668 | 0 |
| 0.9111111111111111 | 0 |
| 0.9118055555555555 | 0 |
| 0.9125 | 0 |
| 0.9131944444444445 | 0 |
| 0.9138888888888889 | 0 |
| 0.9145833333333333 | 0 |
| 0.9152777777777777 | 0 |
| 0.9159722222222223 | 0 |
| 0.9166666666666666 | 0 |
| 0.9173611111111111 | 0 |
| 0.9180555555555556 | 0 |
| 0.9187500000000001 | 0 |
| 0.9194444444444444 | 0 |
| 0.9201388888888888 | 0 |
| 0.9208333333333334 | 0 |
| 0.9215277777777778 | 0 |
| 0.9222222222222222 | 0 |
| 0.9229166666666666 | 0 |
| 0.9236111111111112 | 0 |
| 0.9243055555555556 | 0 |
| 0.9249999999999999 | 0 |
| 0.9256944444444444 | 0 |
| 0.9263888888888889 | 0 |
| 0.9270833333333334 | 0 |
| 0.9277777777777777 | 0 |
| 0.9284722222222223 | 0 |
| 0.9291666666666667 | 0 |
| 0.9298611111111111 | 0 |
| 0.9305555555555555 | 0 |
| 0.93125 | 0 |
| 0.9319444444444445 | 0 |
| 0.9326388888888889 | 0 |
| 0.9333333333333332 | 0 |
| 0.9340277777777778 | 0 |
| 0.9347222222222222 | 0 |
| 0.9354166666666667 | 0 |
| 0.936111111111111 | 0 |
| 0.9368055555555556 | 0 |
| 0.9375 | 0 |
| 0.9381944444444444 | 0 |
| 0.938888888888889 | 0 |
| 0.9395833333333333 | 0 |
| 0.9402777777777778 | 0 |
| 0.9409722222222222 | 0 |
| 0.9416666666666668 | 0 |
| 0.9423611111111111 | 0 |
| 0.9430555555555555 | 0 |
| 0.94375 | 0 |
| 0.9444444444444445 | 0 |
| 0.9451388888888889 | 0 |
| 0.9458333333333333 | 0 |
| 0.9465277777777777 | 0 |
| 0.9472222222222223 | 0 |
| 0.9479166666666666 | 0 |
| 0.9486111111111111 | 0 |
| 0.9493055555555556 | 0 |
| 0.9500000000000001 | 0 |
| 0.9506944444444444 | 0 |
| 0.9513888888888888 | 0 |
| 0.9520833333333334 | 0 |
| 0.9527777777777778 | 0 |
| 0.9534722222222222 | 0 |
| 0.9541666666666666 | 0 |
| 0.9548611111111112 | 0 |
| 0.9555555555555556 | 0 |
| 0.9562499999999999 | 0 |
| 0.9569444444444444 | 0 |
| 0.9576388888888889 | 0 |
| 0.9583333333333334 | 0 |
| 0.9590277777777777 | 0 |
| 0.9597222222222223 | 0 |
| 0.9604166666666667 | 0 |
| 0.9611111111111111 | 0 |
| 0.9618055555555555 | 0 |
| 0.9625 | 0 |
| 0.9631944444444445 | 0 |
| 0.9638888888888889 | 0 |
| 0.9645833333333332 | 0 |
| 0.9652777777777778 | 0 |
| 0.9659722222222222 | 0 |
| 0.9666666666666667 | 0 |
| 0.967361111111111 | 0 |
| 0.9680555555555556 | 0 |
| 0.96875 | 0 |
| 0.9694444444444444 | 0 |
| 0.970138888888889 | 0 |
| 0.9708333333333333 | 0 |
| 0.9715277777777778 | 0 |
| 0.9722222222222222 | 0 |
| 0.9729166666666668 | 0 |
| 0.9736111111111111 | 0 |
| 0.9743055555555555 | 0 |
| 0.975 | 0 |
| 0.9756944444444445 | 0 |
| 0.9763888888888889 | 0 |
| 0.9770833333333333 | 0 |
| 0.9777777777777777 | 0 |
| 0.9784722222222223 | 0 |
| 0.9791666666666666 | 0 |
| 0.9798611111111111 | 0 |
| 0.9805555555555556 | 0 |
| 0.9812500000000001 | 0 |
| 0.9819444444444444 | 0 |
| 0.9826388888888888 | 0 |
| 0.9833333333333334 | 0 |
| 0.9840277777777778 | 0 |
| 0.9847222222222222 | 0 |
| 0.9854166666666666 | 0 |
| 0.9861111111111112 | 0 |
| 0.9868055555555556 | 0 |
| 0.9874999999999999 | 0 |
| 0.9881944444444444 | 0 |
| 0.9888888888888889 | 0 |
| 0.9895833333333334 | 0 |
| 0.9902777777777777 | 0 |
| 0.9909722222222223 | 0 |
| 0.9916666666666667 | 0 |
| 0.9923611111111111 | 0 |
| 0.9930555555555555 | 0 |
| 0.99375 | 0 |
| 0.9944444444444445 | 0 |
| 0.9951388888888889 | 0 |
| 0.9958333333333332 | 0 |
| 0.9965277777777778 | 0 |
| 0.9972222222222222 | 0 |
| 0.9979166666666667 | 0 |
| 0.998611111111111 | 0 |
| 0.9993055555555556 | 0 |